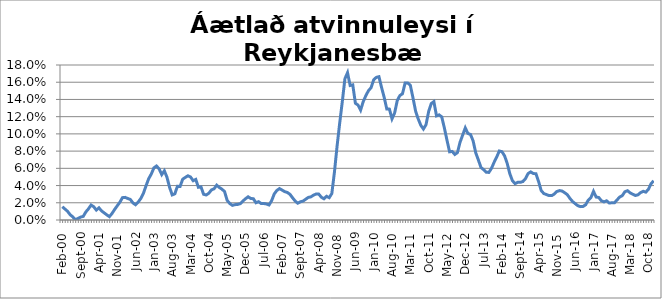
| Category | Series 0 |
|---|---|
| feb.00 | 0.015 |
| mar.00 | 0.013 |
| apr.00 | 0.01 |
| maí.00 | 0.006 |
| jún.00 | 0.004 |
| júl.00 | 0 |
| ágú.00 | 0.002 |
| sep.00 | 0.003 |
| okt.00 | 0.004 |
| nóv.00 | 0.009 |
| des.00 | 0.013 |
| jan.01 | 0.017 |
| feb.01 | 0.015 |
| mar.01 | 0.012 |
| apr.01 | 0.014 |
| maí.01 | 0.011 |
| jún.01 | 0.008 |
| júl.01 | 0.006 |
| ágú.01 | 0.004 |
| sep.01 | 0.008 |
| okt.01 | 0.012 |
| nóv.01 | 0.016 |
| des.01 | 0.021 |
| jan.02 | 0.026 |
| feb.02 | 0.026 |
| mar.02 | 0.025 |
| apr.02 | 0.024 |
| maí.02 | 0.02 |
| jún.02 | 0.018 |
| júl.02 | 0.021 |
| ágú.02 | 0.025 |
| sep.02 | 0.031 |
| okt.02 | 0.04 |
| nóv.02 | 0.048 |
| des.02 | 0.053 |
| jan.03 | 0.061 |
| feb.03 | 0.063 |
| mar.03 | 0.059 |
| apr.03 | 0.053 |
| maí.03 | 0.057 |
| jún.03 | 0.05 |
| júl.03 | 0.038 |
| ágú.03 | 0.029 |
| sep.03 | 0.03 |
| okt.03 | 0.039 |
| nóv.03 | 0.039 |
| des.03 | 0.047 |
| jan.04 | 0.049 |
| feb.04 | 0.051 |
| mar.04 | 0.05 |
| apr.04 | 0.046 |
| maí.04 | 0.047 |
| jún.04 | 0.038 |
| júl.04 | 0.038 |
| ágú.04 | 0.03 |
| sep.04 | 0.029 |
| okt.04 | 0.031 |
| nóv.04 | 0.035 |
| des.04 | 0.036 |
| jan.05 | 0.04 |
| feb.05 | 0.038 |
| mar.05 | 0.036 |
| apr.05 | 0.033 |
| maí.05 | 0.023 |
| jún.05 | 0.019 |
| júl.05 | 0.017 |
| ágú.05 | 0.018 |
| sep.05 | 0.018 |
| okt.05 | 0.019 |
| nóv.05 | 0.022 |
| des.05 | 0.025 |
| jan.06 | 0.027 |
| feb.06 | 0.025 |
| mar.06 | 0.025 |
| apr.06 | 0.02 |
| maí.06 | 0.021 |
| jún.06 | 0.019 |
| júl.06 | 0.019 |
| ágú.06 | 0.019 |
| sep.06 | 0.017 |
| okt.06 | 0.022 |
| nóv.06 | 0.03 |
| des.06 | 0.034 |
| jan.07 | 0.037 |
| feb.07 | 0.035 |
| mar.07 | 0.033 |
| apr.07 | 0.032 |
| maí.07 | 0.03 |
| jún.07 | 0.026 |
| júl.07 | 0.022 |
| ágú.07 | 0.019 |
| sep.07 | 0.021 |
| okt.07 | 0.022 |
| nóv.07 | 0.024 |
| des.07 | 0.026 |
| jan.08 | 0.027 |
| feb.08 | 0.029 |
| mar.08 | 0.03 |
| apr.08 | 0.03 |
| maí.08 | 0.026 |
| jún.08 | 0.025 |
| júl.08 | 0.028 |
| ágú.08 | 0.026 |
| sep.08 | 0.031 |
| okt.08 | 0.056 |
| nóv.08 | 0.086 |
| des.08 | 0.112 |
| jan.09 | 0.137 |
| feb.09 | 0.164 |
| mar.09 | 0.171 |
| apr.09 | 0.156 |
| maí.09 | 0.157 |
| jún.09 | 0.136 |
| júl.09 | 0.134 |
| ágú.09 | 0.128 |
| sep.09 | 0.137 |
| okt.09 | 0.144 |
| nóv.09 | 0.15 |
| des.09 | 0.154 |
| jan.10 | 0.163 |
| feb.10 | 0.166 |
| mar.10 | 0.166 |
| apr.10 | 0.154 |
| maí.10 | 0.143 |
| jún.10 | 0.129 |
| júl.10 | 0.129 |
| ágú.10 | 0.117 |
| sep.10 | 0.124 |
| okt.10 | 0.139 |
| nóv.10 | 0.145 |
| des.10 | 0.147 |
| jan.11 | 0.159 |
| feb.11 | 0.159 |
| mar.11 | 0.156 |
| apr.11 | 0.142 |
| maí.11 | 0.127 |
| jún.11 | 0.117 |
| júl.11 | 0.11 |
| ágú.11 | 0.106 |
| sep.11 | 0.111 |
| okt.11 | 0.126 |
| nóv.11 | 0.135 |
| des.11 | 0.137 |
| jan.12 | 0.121 |
| feb.12 | 0.122 |
| mar.12 | 0.12 |
| apr.12 | 0.107 |
| maí.12 | 0.093 |
| jún.12 | 0.079 |
| júl.12 | 0.08 |
| ágú.12 | 0.076 |
| sep.12 | 0.078 |
| okt.12 | 0.09 |
| nóv.12 | 0.099 |
| des.12 | 0.107 |
| jan.13 | 0.1 |
| feb.13 | 0.099 |
| mar.13 | 0.092 |
| apr.13 | 0.078 |
| maí.13 | 0.07 |
| jún.13 | 0.061 |
| júl.13 | 0.058 |
| ágú.13 | 0.055 |
| sep.13 | 0.055 |
| okt.13 | 0.06 |
| nóv.13 | 0.067 |
| des.13 | 0.073 |
| jan.14* | 0.08 |
| feb.14 | 0.079 |
| mar.14 | 0.075 |
| apr.14 | 0.066 |
| maí.14 | 0.054 |
| jún.14 | 0.046 |
| júl.14 | 0.042 |
| ágú.14 | 0.044 |
| sep.14 | 0.044 |
| okt.14 | 0.045 |
| nóv.14 | 0.048 |
| des.14 | 0.054 |
| jan.15 | 0.056 |
| feb.15 | 0.054 |
| mar.15 | 0.054 |
| apr.15 | 0.045 |
| maí.15 | 0.034 |
| jún.15 | 0.031 |
| júl.15 | 0.03 |
| ágú.15 | 0.028 |
| sep.15 | 0.028 |
| okt.15 | 0.03 |
| nóv.15 | 0.033 |
| des.15 | 0.034 |
| jan.16 | 0.034 |
| feb.16 | 0.032 |
| mar.16 | 0.029 |
| apr.16 | 0.025 |
| maí.16 | 0.021 |
| jún.16 | 0.019 |
| júl.16 | 0.017 |
| ágú.16 | 0.016 |
| sep.16 | 0.016 |
| okt.16 | 0.018 |
| nóv.16 | 0.023 |
| des.16 | 0.026 |
| jan.17 | 0.033 |
| feb.17 | 0.027 |
| mar.17 | 0.026 |
| apr.17 | 0.022 |
| maí.17 | 0.021 |
| jún.17 | 0.022 |
| júl.17 | 0.02 |
| ágú.17 | 0.02 |
| sep.17 | 0.02 |
| okt.17 | 0.023 |
| nóv.17 | 0.027 |
| des.17 | 0.028 |
| jan.18 | 0.033 |
| feb.18 | 0.034 |
| mar.18 | 0.031 |
| apr.18 | 0.03 |
| maí.18 | 0.028 |
| jún.18 | 0.029 |
| júl.18 | 0.032 |
| ágú.18 | 0.033 |
| sep.18 | 0.032 |
| okt.18 | 0.036 |
| nóv.18 | 0.042 |
| des.18 | 0.046 |